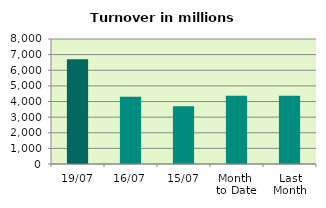
| Category | Series 0 |
|---|---|
| 19/07 | 6706.046 |
| 16/07 | 4303.057 |
| 15/07 | 3695.581 |
| Month 
to Date | 4374.412 |
| Last
Month | 4366.67 |